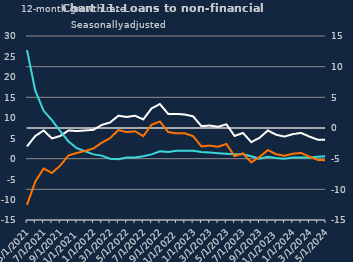
| Category | zero | Non-financial businesses | SMEs |
|---|---|---|---|
| May-2021 |  | -3 | 12.7 |
| Jun-2021 |  | -1.3 | 6.1 |
| Jul-2021 |  | -0.4 | 2.8 |
| Aug-2021 |  | -1.7 | 1.3 |
| Sep-2021 |  | -1.3 | -0.5 |
| Oct-2021 |  | -0.4 | -2.2 |
| Nov-2021 |  | -0.5 | -3.3 |
| Dec-2021 |  | -0.4 | -3.8 |
| Jan-2022 |  | -0.3 | -4.3 |
| Feb-2022 |  | 0.5 | -4.5 |
| Mar-2022 |  | 0.9 | -5 |
| Apr-2022 |  | 2 | -5.1 |
| May-2022 |  | 1.8 | -4.8 |
| Jun-2022 |  | 2 | -4.8 |
| Jul-2022 |  | 1.4 | -4.6 |
| Aug-2022 |  | 3.2 | -4.3 |
| Sep-2022 |  | 3.9 | -3.8 |
| Oct-2022 |  | 2.3 | -3.9 |
| Nov-2022 |  | 2.3 | -3.7 |
| Dec-2022 |  | 2.2 | -3.7 |
| Jan-2023 |  | 1.9 | -3.7 |
| Feb-2023 |  | 0.3 | -3.9 |
| Mar-2023 |  | 0.4 | -4 |
| Apr-2023 |  | 0.2 | -4.1 |
| May-2023 |  | 0.6 | -4.2 |
| Jun-2023 |  | -1.3 | -4.3 |
| Jul-2023 |  | -0.8 | -4.3 |
| Aug-2023 |  | -2.3 | -4.6 |
| Sep-2023 |  | -1.6 | -5 |
| Oct-2023 |  | -0.4 | -4.7 |
| Nov-2023 |  | -1.1 | -4.9 |
| Dec-2023 |  | -1.4 | -5 |
| Jan-2024 |  | -1 | -4.8 |
| Feb-2024 |  | -0.8 | -4.8 |
| Mar-2024 |  | -1.4 | -4.8 |
| Apr-2024 |  | -1.9 | -4.7 |
| May-2024 |  | -1.9 | -4.6 |